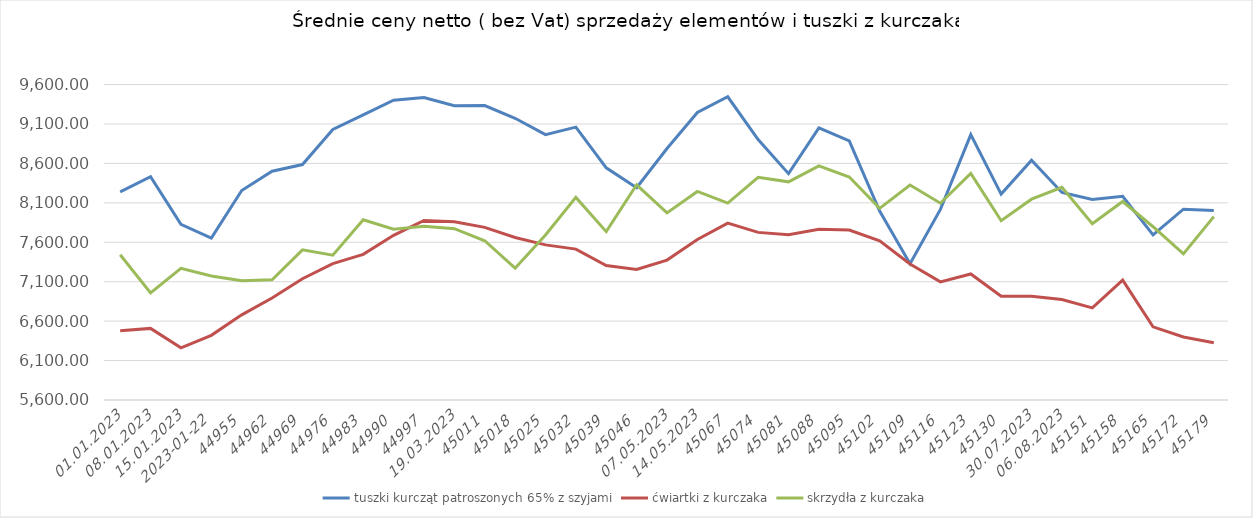
| Category | tuszki kurcząt patroszonych 65% z szyjami | ćwiartki z kurczaka | skrzydła z kurczaka |
|---|---|---|---|
| 01.01.2023 | 8239.088 | 6478.339 | 7441.309 |
| 08.01.2023 | 8430.853 | 6507.911 | 6957.436 |
| 15.01.2023 | 7828.459 | 6262.111 | 7269.677 |
| 2023-01-22 | 7652.588 | 6419.556 | 7172.429 |
| 29.01.2023 | 8256 | 6680 | 7112 |
| 05.02.2023 | 8500.431 | 6892.491 | 7125.097 |
| 12.02.2023 | 8585.238 | 7138.262 | 7503.717 |
| 19.02.2023 | 9030.362 | 7328.974 | 7435.859 |
| 26.02.2023 | 9215.848 | 7446.497 | 7885.419 |
| 05.03.2023 | 9401.846 | 7688.202 | 7765.107 |
| 12.03.2023 | 9434.464 | 7876.798 | 7803.643 |
| 19.03.2023 | 9331.901 | 7859.449 | 7772.184 |
| 26.03.2023 | 9333.895 | 7788.951 | 7619.359 |
| 02.04.2023 | 9172.247 | 7660.041 | 7271.632 |
| 09.04.2023 | 8964.759 | 7566.701 | 7693.056 |
| 16.04.2023 | 9059.955 | 7513.391 | 8169.201 |
| 23.04.2023 | 8544.411 | 7305.19 | 7734.947 |
| 30.04.2023 | 8292.678 | 7254.26 | 8328.739 |
| 07.05.2023 | 8788.369 | 7374.385 | 7973.04 |
| 14.05.2023 | 9245.3 | 7635.695 | 8244.73 |
| 21.05.2023 | 9444.858 | 7842.274 | 8096.703 |
| 28.05.2023 | 8901.948 | 7725.304 | 8423.476 |
| 04.06.2023 | 8469.818 | 7695.352 | 8366.526 |
| 11.06.2023 | 9049.604 | 7764.446 | 8568.01 |
| 18.06.2023 | 8884.474 | 7755.893 | 8428.1 |
| 25.06.2023 | 7995.945 | 7618.03 | 8030.56 |
| 02.07.2023 | 7328.046 | 7324.109 | 8326.527 |
| 09.07.2023 | 8016.777 | 7098.27 | 8094.96 |
| 16.07.2023 | 8964.293 | 7198.29 | 8473.842 |
| 23.07.2023 | 8210.968 | 6915.341 | 7873.405 |
| 30.07.2023 | 8641.055 | 6914.299 | 8146.391 |
| 06.08.2023 | 8231.69 | 6874.892 | 8296.098 |
| 13.08.2023 | 8141.343 | 6768.317 | 7834.812 |
| 20.08.2023 | 8183.942 | 7120.595 | 8117.301 |
| 27.08.2023 | 7694.006 | 6527.856 | 7797.118 |
| 03.09.2023 | 8019.923 | 6398.595 | 7453.135 |
| 10.09.2023 | 8002.223 | 6324.864 | 7925.396 |